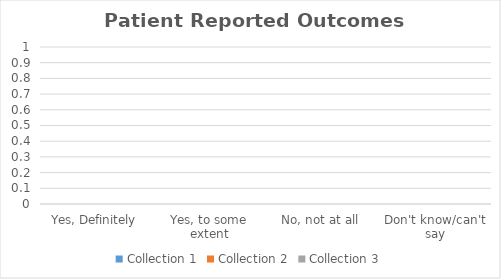
| Category | Collection 1 | Collection 2 | Collection 3 |
|---|---|---|---|
| Yes, Definitely | 0 | 0 | 0 |
| Yes, to some extent | 0 | 0 | 0 |
| No, not at all | 0 | 0 | 0 |
| Don't know/can't say | 0 | 0 | 0 |